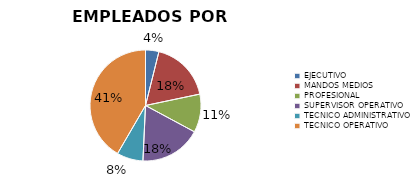
| Category | Series 0 |
|---|---|
| EJECUTIVO | 108 |
| MANDOS MEDIOS | 494 |
| PROFESIONAL | 309 |
| SUPERVISOR OPERATIVO | 496 |
| TECNICO ADMINISTRATIVO | 212 |
| TECNICO OPERATIVO | 1154 |